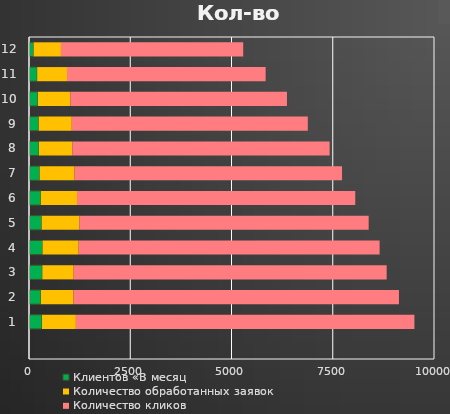
| Category | Клиентов «В месяц | Количество обработанных заявок  | Количество кликов  |
|---|---|---|---|
| 0 | 114 | 675 | 4500 |
| 1 | 202.5 | 735.75 | 4905 |
| 2 | 220.725 | 801.968 | 5346.45 |
| 3 | 240.59 | 815.868 | 5827.63 |
| 4 | 244.76 | 825.775 | 6352.117 |
| 5 | 264.248 | 858.806 | 6606.202 |
| 6 | 291.994 | 893.159 | 6870.45 |
| 7 | 312.605 | 928.885 | 7145.268 |
| 8 | 334.399 | 891.729 | 7431.079 |
| 9 | 329.94 | 772.832 | 7728.322 |
| 10 | 293.676 | 803.745 | 8037.455 |
| 11 | 321.498 | 835.895 | 8358.953 |